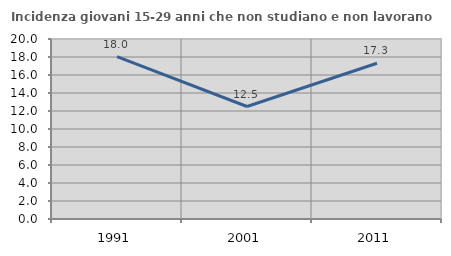
| Category | Incidenza giovani 15-29 anni che non studiano e non lavorano  |
|---|---|
| 1991.0 | 18.039 |
| 2001.0 | 12.5 |
| 2011.0 | 17.308 |